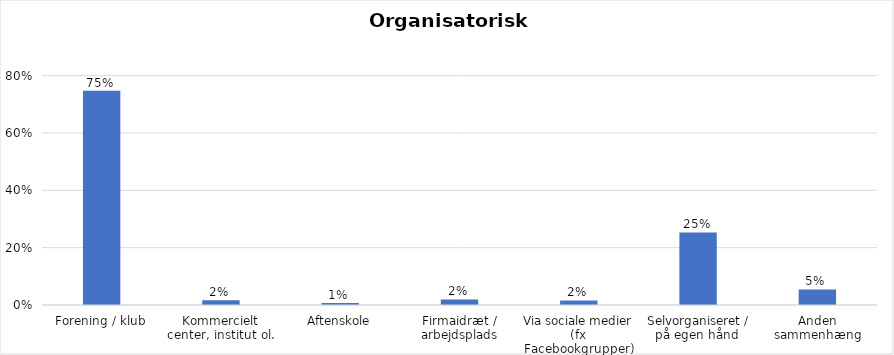
| Category | % |
|---|---|
| Forening / klub | 0.747 |
| Kommercielt center, institut ol. | 0.016 |
| Aftenskole | 0.007 |
| Firmaidræt / arbejdsplads | 0.019 |
| Via sociale medier (fx Facebookgrupper) | 0.016 |
| Selvorganiseret / på egen hånd  | 0.253 |
| Anden sammenhæng | 0.054 |